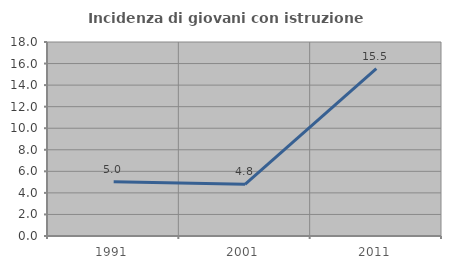
| Category | Incidenza di giovani con istruzione universitaria |
|---|---|
| 1991.0 | 5.031 |
| 2001.0 | 4.795 |
| 2011.0 | 15.528 |